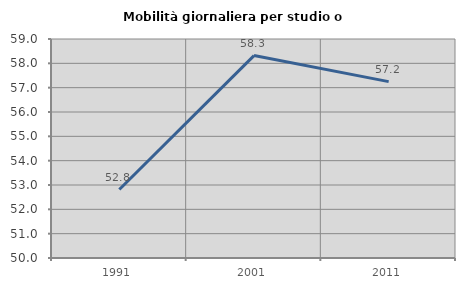
| Category | Mobilità giornaliera per studio o lavoro |
|---|---|
| 1991.0 | 52.814 |
| 2001.0 | 58.319 |
| 2011.0 | 57.248 |